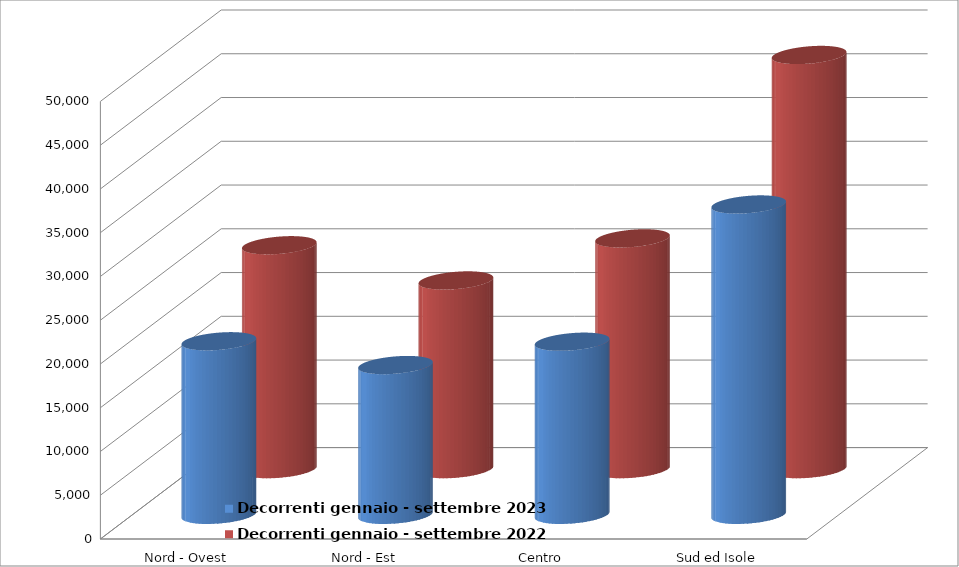
| Category | Decorrenti gennaio - settembre 2023 | Decorrenti gennaio - settembre 2022 |
|---|---|---|
| Nord - Ovest | 19836 | 25584 |
| Nord - Est | 17118 | 21562 |
| Centro | 19783 | 26370 |
| Sud ed Isole | 35465 | 47326 |